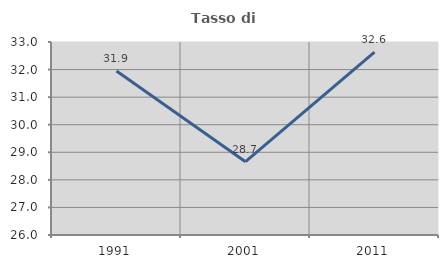
| Category | Tasso di occupazione   |
|---|---|
| 1991.0 | 31.948 |
| 2001.0 | 28.659 |
| 2011.0 | 32.636 |